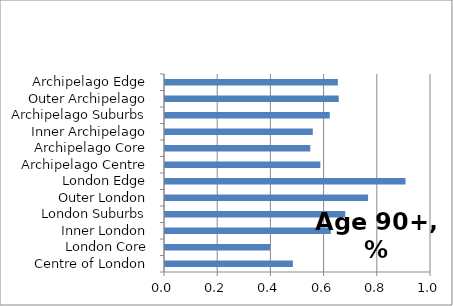
| Category | Series 0 |
|---|---|
| Centre of London | 0.481 |
| London Core | 0.395 |
| Inner London | 0.623 |
| London Suburbs | 0.678 |
| Outer London | 0.763 |
| London Edge | 0.904 |
| Archipelago Centre | 0.584 |
| Archipelago Core | 0.546 |
| Inner Archipelago | 0.556 |
| Archipelago Suburbs | 0.619 |
| Outer Archipelago | 0.653 |
| Archipelago Edge | 0.65 |